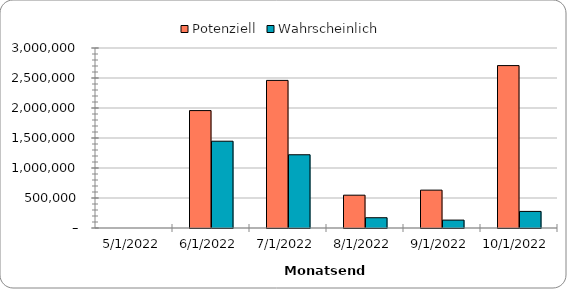
| Category | Potenziell | Wahrscheinlich |
|---|---|---|
| 10/31/22 | 2707000 | 276400 |
| 9/30/22 | 631000 | 131650 |
| 8/31/22 | 547000 | 171300 |
| 7/31/22 | 2460000 | 1220600 |
| 6/30/22 | 1957000 | 1446600 |
| 5/31/22 | 0 | 0 |